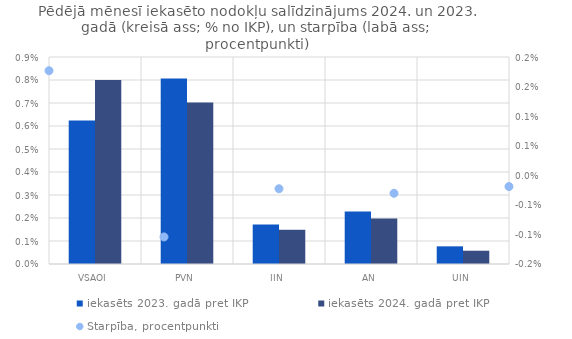
| Category | iekasēts 2023. gadā pret IKP | iekasēts 2024. gadā pret IKP |
|---|---|---|
| VSAOI | 0.006 | 0.008 |
| PVN | 0.008 | 0.007 |
| IIN | 0.002 | 0.001 |
| AN | 0.002 | 0.002 |
| UIN | 0.001 | 0.001 |